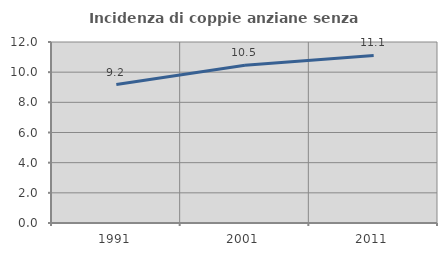
| Category | Incidenza di coppie anziane senza figli  |
|---|---|
| 1991.0 | 9.181 |
| 2001.0 | 10.458 |
| 2011.0 | 11.111 |